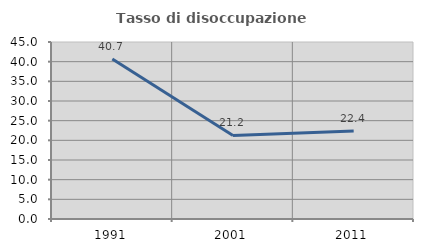
| Category | Tasso di disoccupazione giovanile  |
|---|---|
| 1991.0 | 40.701 |
| 2001.0 | 21.245 |
| 2011.0 | 22.353 |